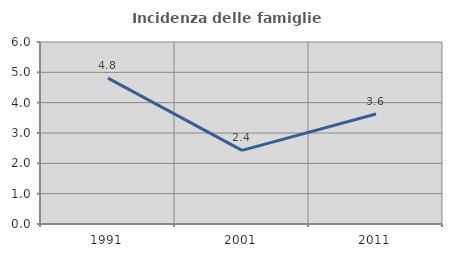
| Category | Incidenza delle famiglie numerose |
|---|---|
| 1991.0 | 4.808 |
| 2001.0 | 2.427 |
| 2011.0 | 3.627 |